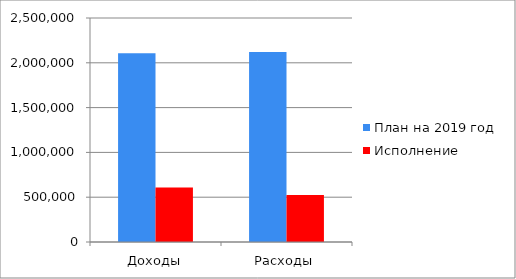
| Category | План на 2019 год | Исполнение |
|---|---|---|
| Доходы | 2107320 | 606911 |
| Расходы | 2120084 | 524173 |